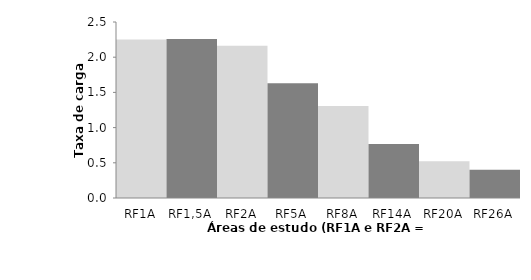
| Category | Series 0 |
|---|---|
| RF1A | 2.252 |
| RF1,5A | 2.258 |
| RF2A | 2.163 |
| RF5A | 1.63 |
| RF8A | 1.306 |
| RF14A | 0.766 |
| RF20A | 0.521 |
| RF26A | 0.401 |